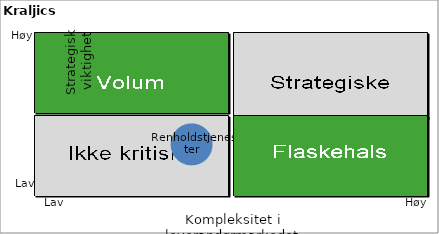
| Category | Renholdstjenester |
|---|---|
| 2.6000000000000005 | 2.3 |